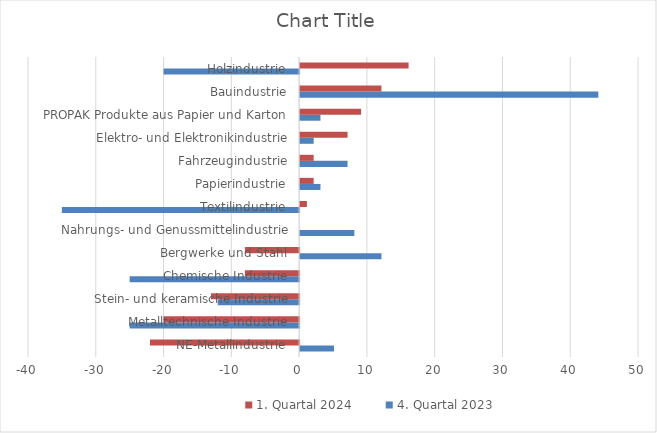
| Category | 4. Quartal 2023 | 1. Quartal 2024 |
|---|---|---|
| NE-Metallindustrie | 5 | -22 |
| Metalltechnische Industrie | -25 | -20 |
| Stein- und keramische Industrie | -12 | -13 |
| Chemische Industrie | -25 | -8 |
| Bergwerke und Stahl | 12 | -8 |
| Nahrungs- und Genussmittelindustrie | 8 | 0 |
| Textilindustrie | -35 | 1 |
| Papierindustrie | 3 | 2 |
| Fahrzeugindustrie | 7 | 2 |
| Elektro- und Elektronikindustrie | 2 | 7 |
| PROPAK Produkte aus Papier und Karton | 3 | 9 |
| Bauindustrie | 44 | 12 |
| Holzindustrie | -20 | 16 |